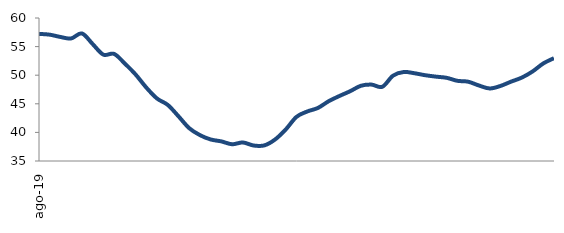
| Category | Series 0 |
|---|---|
| 2019-08-01 | 57.226 |
| 2019-09-01 | 57.084 |
| 2019-10-01 | 56.682 |
| 2019-11-01 | 56.425 |
| 2019-12-01 | 57.298 |
| 2020-01-01 | 55.449 |
| 2020-02-01 | 53.592 |
| 2020-03-01 | 53.724 |
| 2020-04-01 | 52.032 |
| 2020-05-01 | 50.132 |
| 2020-06-01 | 47.839 |
| 2020-07-01 | 45.923 |
| 2020-08-01 | 44.807 |
| 2020-09-01 | 42.819 |
| 2020-10-01 | 40.739 |
| 2020-11-01 | 39.526 |
| 2020-12-01 | 38.764 |
| 2021-01-01 | 38.426 |
| 2021-02-01 | 37.926 |
| 2021-03-01 | 38.241 |
| 2021-04-01 | 37.709 |
| 2021-05-01 | 37.728 |
| 2021-06-01 | 38.756 |
| 2021-07-01 | 40.518 |
| 2021-08-01 | 42.719 |
| 2021-09-01 | 43.654 |
| 2021-10-01 | 44.278 |
| 2021-11-01 | 45.454 |
| 2021-12-01 | 46.366 |
| 2022-01-01 | 47.2 |
| 2022-02-01 | 48.15 |
| 2022-03-01 | 48.353 |
| 2022-04-01 | 47.979 |
| 2022-05-01 | 49.924 |
| 2022-06-01 | 50.56 |
| 2022-07-01 | 50.34 |
| 2022-08-01 | 49.995 |
| 2022-09-01 | 49.749 |
| 2022-10-01 | 49.539 |
| 2022-11-01 | 49.017 |
| 2022-12-01 | 48.863 |
| 2023-01-01 | 48.201 |
| 2023-02-01 | 47.68 |
| 2023-03-01 | 48.113 |
| 2023-04-01 | 48.873 |
| 2023-05-01 | 49.582 |
| 2023-06-01 | 50.651 |
| 2023-07-01 | 52.053 |
| 2023-08-01 | 52.98 |